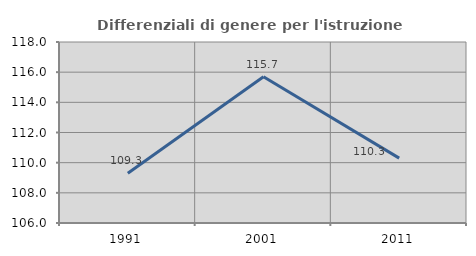
| Category | Differenziali di genere per l'istruzione superiore |
|---|---|
| 1991.0 | 109.299 |
| 2001.0 | 115.694 |
| 2011.0 | 110.3 |